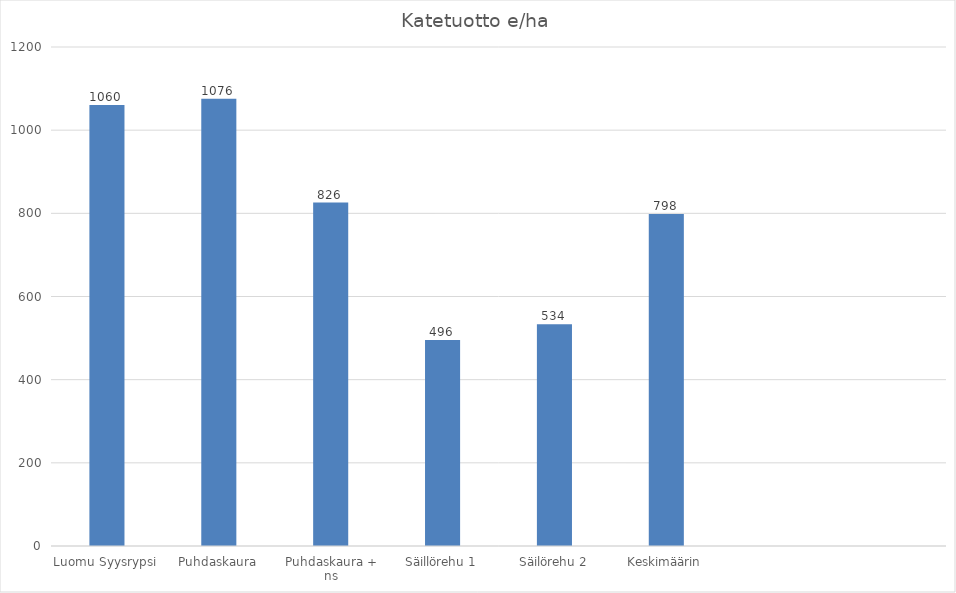
| Category | e/ha |
|---|---|
| Luomu Syysrypsi | 1060.3 |
| Puhdaskaura | 1075.82 |
| Puhdaskaura + ns | 825.78 |
| Säillörehu 1 | 495.5 |
| Säilörehu 2 | 533.5 |
| Keskimäärin | 798.18 |